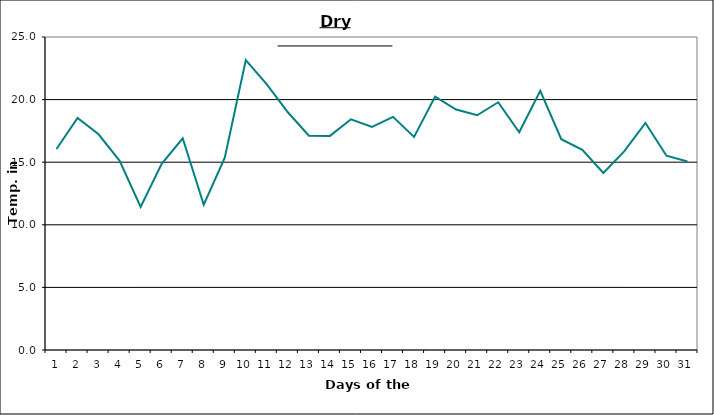
| Category | Series 0 |
|---|---|
| 0 | 16.058 |
| 1 | 18.53 |
| 2 | 17.23 |
| 3 | 15.11 |
| 4 | 11.43 |
| 5 | 14.87 |
| 6 | 16.91 |
| 7 | 11.6 |
| 8 | 15.36 |
| 9 | 23.15 |
| 10 | 21.22 |
| 11 | 18.99 |
| 12 | 17.11 |
| 13 | 17.1 |
| 14 | 18.43 |
| 15 | 17.82 |
| 16 | 18.62 |
| 17 | 17.02 |
| 18 | 20.24 |
| 19 | 19.21 |
| 20 | 18.75 |
| 21 | 19.79 |
| 22 | 17.39 |
| 23 | 20.7 |
| 24 | 16.84 |
| 25 | 15.992 |
| 26 | 14.14 |
| 27 | 15.88 |
| 28 | 18.13 |
| 29 | 15.52 |
| 30 | 15.05 |